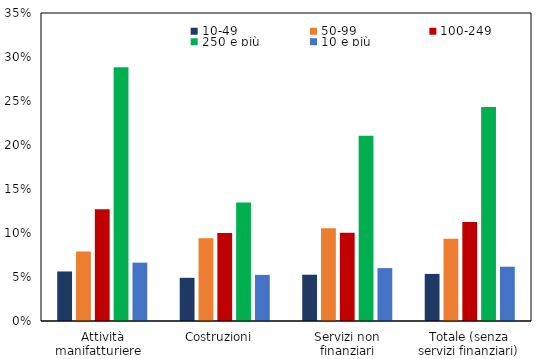
| Category | 10-49   | 50-99   | 100-249   | 250 e più   | 10 e più   |
|---|---|---|---|---|---|
| Attività manifatturiere   | 0.056 | 0.079 | 0.127 | 0.288 | 0.066 |
| Costruzioni   | 0.049 | 0.094 | 0.1 | 0.135 | 0.052 |
| Servizi non finanziari | 0.053 | 0.105 | 0.1 | 0.211 | 0.06 |
| Totale (senza servizi finanziari) | 0.054 | 0.094 | 0.113 | 0.243 | 0.062 |